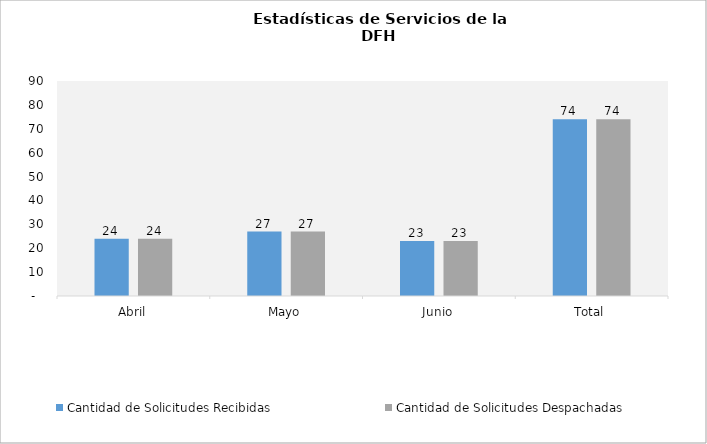
| Category | Cantidad de Solicitudes |
|---|---|
| Abril | 24 |
| Mayo | 27 |
| Junio | 23 |
| Total | 74 |